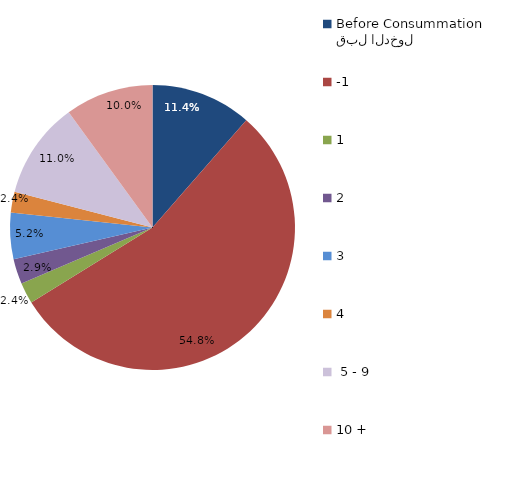
| Category | Series 0 |
|---|---|
| قبل الدخول
Before Consummation | 11.429 |
| -1 | 54.762 |
| 1 | 2.381 |
| 2 | 2.857 |
| 3 | 5.238 |
| 4 | 2.381 |
|  5 - 9 | 10.952 |
| 10 + | 10 |